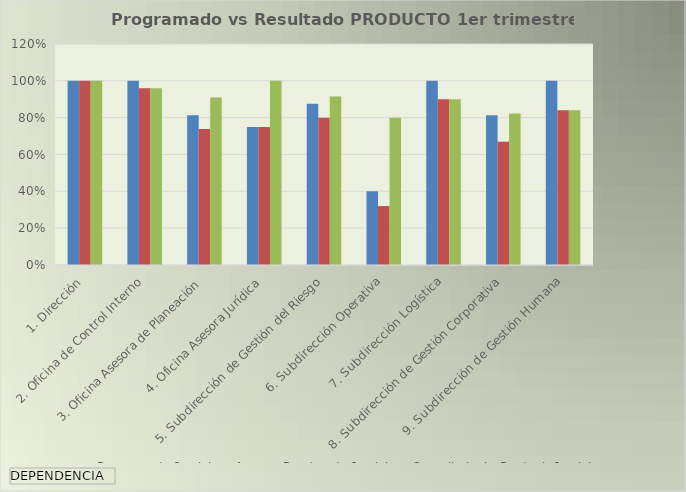
| Category | Programado 1er tri. | Avance Ponderado 1er tri. | Cumplimiento Producto1er tri. |
|---|---|---|---|
| 1. Dirección | 1 | 1 | 1 |
| 2. Oficina de Control Interno | 1 | 0.96 | 0.96 |
| 3. Oficina Asesora de Planeación | 0.812 | 0.739 | 0.909 |
| 4. Oficina Asesora Jurídica | 0.75 | 0.75 | 1 |
| 5. Subdirección de Gestión del Riesgo | 0.875 | 0.8 | 0.914 |
| 6. Subdirección Operativa | 0.4 | 0.32 | 0.8 |
| 7. Subdirección Logística | 1 | 0.9 | 0.9 |
| 8. Subdirección de Gestión Corporativa | 0.812 | 0.669 | 0.823 |
| 9. Subdirección de Gestión Humana | 1 | 0.84 | 0.84 |